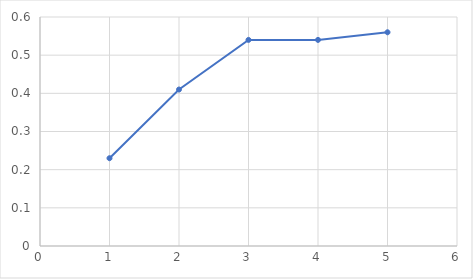
| Category | Series 0 |
|---|---|
| 1.0 | 0.23 |
| 2.0 | 0.41 |
| 3.0 | 0.54 |
| 4.0 | 0.54 |
| 5.0 | 0.56 |